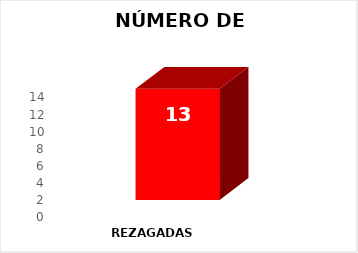
| Category | NÚMERO DE METAS |
|---|---|
| REZAGADAS  | 13 |